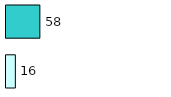
| Category | Series 0 | Series 1 |
|---|---|---|
| 0 | 16 | 58 |